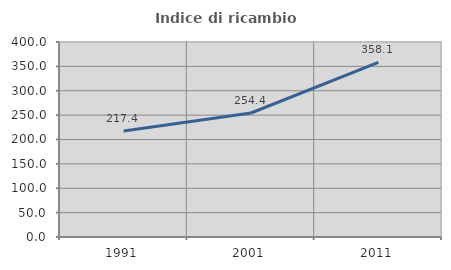
| Category | Indice di ricambio occupazionale  |
|---|---|
| 1991.0 | 217.45 |
| 2001.0 | 254.362 |
| 2011.0 | 358.12 |